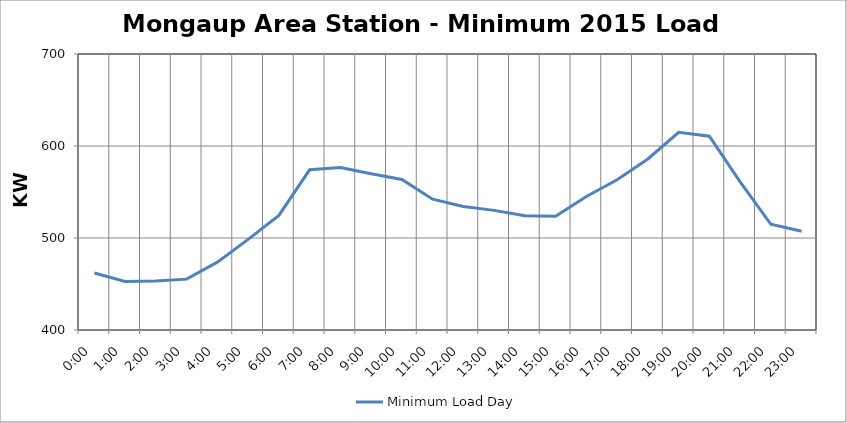
| Category | Minimum Load Day |
|---|---|
| 0.0 | 462 |
| 0.041666666666666664 | 452.76 |
| 0.08333333333333333 | 453.18 |
| 0.125 | 455.28 |
| 0.16666666666666666 | 473.76 |
| 0.20833333333333334 | 498.54 |
| 0.25 | 524.58 |
| 0.2916666666666667 | 574.14 |
| 0.3333333333333333 | 576.66 |
| 0.375 | 569.94 |
| 0.4166666666666667 | 563.64 |
| 0.4583333333333333 | 542.22 |
| 0.5 | 534.24 |
| 0.5416666666666666 | 530.04 |
| 0.5833333333333334 | 524.16 |
| 0.625 | 523.74 |
| 0.6666666666666666 | 545.16 |
| 0.7083333333333334 | 563.22 |
| 0.75 | 585.9 |
| 0.7916666666666666 | 614.88 |
| 0.8333333333333334 | 610.68 |
| 0.875 | 561.12 |
| 0.9166666666666666 | 514.92 |
| 0.9583333333333334 | 507.36 |